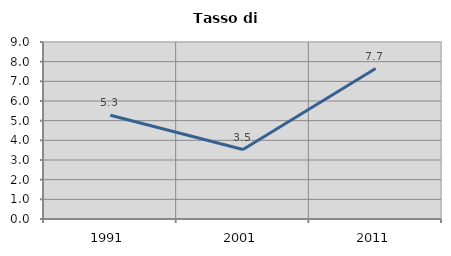
| Category | Tasso di disoccupazione   |
|---|---|
| 1991.0 | 5.278 |
| 2001.0 | 3.53 |
| 2011.0 | 7.651 |